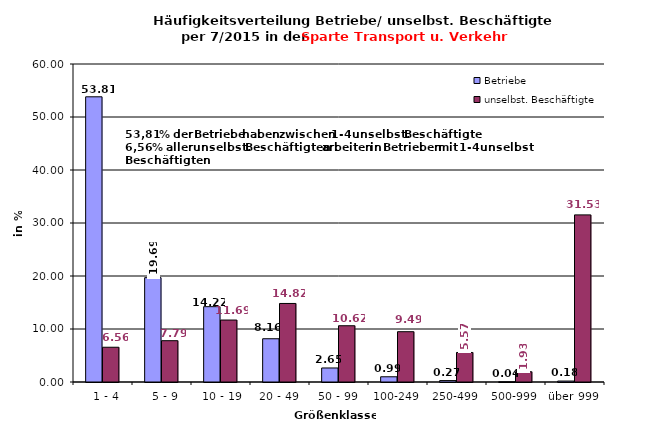
| Category | Betriebe | unselbst. Beschäftigte |
|---|---|---|
|   1 - 4 | 53.812 | 6.559 |
|   5 - 9 | 19.686 | 7.792 |
|  10 - 19 | 14.215 | 11.691 |
| 20 - 49 | 8.161 | 14.818 |
| 50 - 99 | 2.646 | 10.616 |
| 100-249 | 0.987 | 9.493 |
| 250-499 | 0.269 | 5.57 |
| 500-999 | 0.045 | 1.932 |
| über 999 | 0.179 | 31.53 |